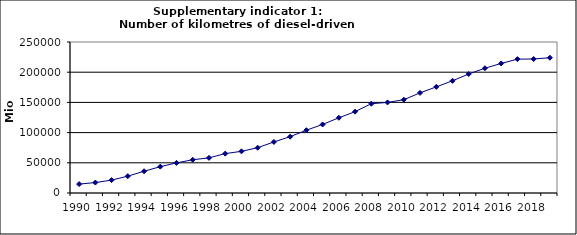
| Category | Number of kilometres of diesel-driven passenger cars, Mio km |
|---|---|
| 1990 | 14717.435 |
| 1991 | 17306.443 |
| 1992 | 21359.321 |
| 1993 | 27866.991 |
| 1994 | 36026.063 |
| 1995 | 43609.619 |
| 1996 | 49869.768 |
| 1997 | 55028.811 |
| 1998 | 58179.786 |
| 1999 | 65198.668 |
| 2000 | 68999.741 |
| 2001 | 75015.534 |
| 2002 | 84524.752 |
| 2003 | 93257.628 |
| 2004 | 103952.55 |
| 2005 | 113495.429 |
| 2006 | 124549.25 |
| 2007 | 134669.603 |
| 2008 | 147824.09 |
| 2009 | 149960.461 |
| 2010 | 154515.443 |
| 2011 | 165790.94 |
| 2012 | 175672.551 |
| 2013 | 185766.823 |
| 2014 | 196985.455 |
| 2015 | 206597.77 |
| 2016 | 214501.181 |
| 2017 | 221596.01 |
| 2018 | 221861.811 |
| 2019 | 223966.908 |